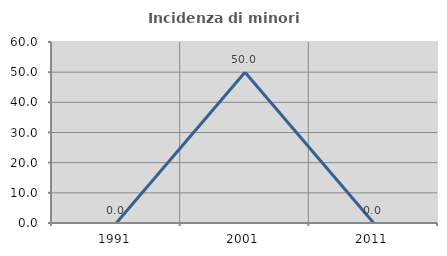
| Category | Incidenza di minori stranieri |
|---|---|
| 1991.0 | 0 |
| 2001.0 | 50 |
| 2011.0 | 0 |